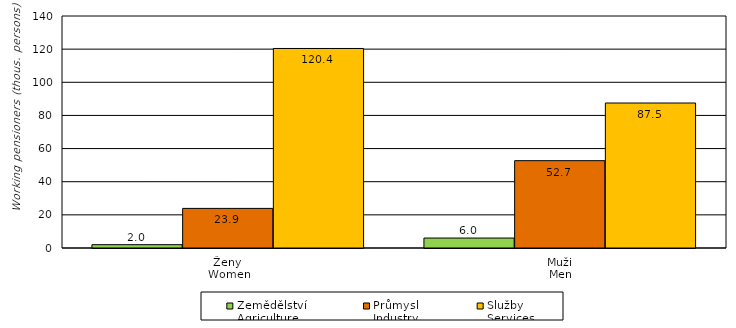
| Category | Zemědělství
Agriculture | Průmysl
Industry | Služby
Services |
|---|---|---|---|
| Ženy 
Women | 2 | 23.9 | 120.4 |
| Muži 
Men | 6 | 52.7 | 87.5 |